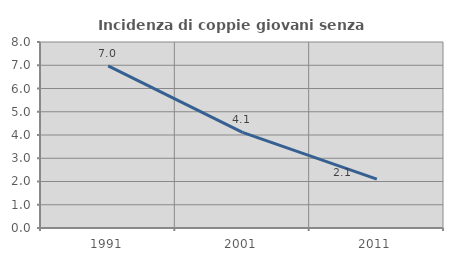
| Category | Incidenza di coppie giovani senza figli |
|---|---|
| 1991.0 | 6.977 |
| 2001.0 | 4.11 |
| 2011.0 | 2.105 |